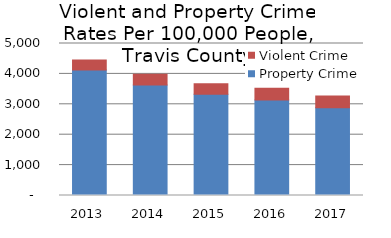
| Category | Property Crime | Violent Crime |
|---|---|---|
| 2013.0 | 4128.367 | 325.32 |
| 2014.0 | 3630.894 | 357.424 |
| 2015.0 | 3329.093 | 347.522 |
| 2016.0 | 3138.737 | 387.428 |
| 2017.0 | 2884.651 | 385.511 |